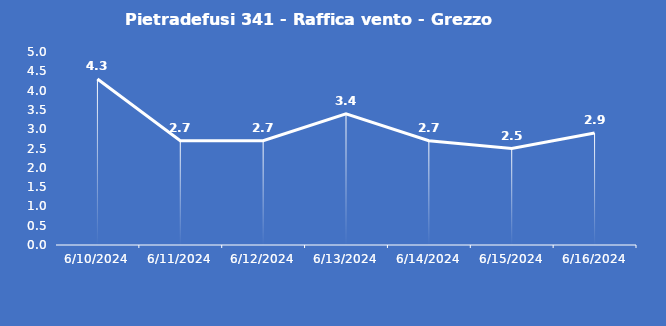
| Category | Pietradefusi 341 - Raffica vento - Grezzo (m/s) |
|---|---|
| 6/10/24 | 4.3 |
| 6/11/24 | 2.7 |
| 6/12/24 | 2.7 |
| 6/13/24 | 3.4 |
| 6/14/24 | 2.7 |
| 6/15/24 | 2.5 |
| 6/16/24 | 2.9 |